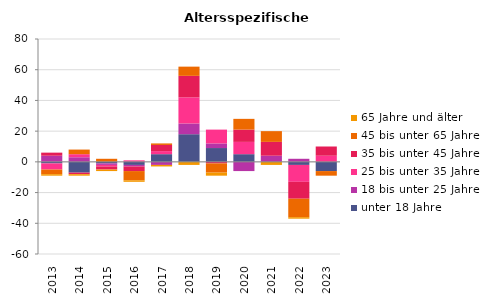
| Category | unter 18 Jahre | 18 bis unter 25 Jahre | 25 bis unter 35 Jahre | 35 bis unter 45 Jahre | 45 bis unter 65 Jahre | 65 Jahre und älter |
|---|---|---|---|---|---|---|
| 2013.0 | -1 | 4 | -4 | 2 | -3 | -1 |
| 2014.0 | -7 | 3 | 2 | -1 | 3 | -1 |
| 2015.0 | -1 | -1 | -1 | -2 | 2 | -1 |
| 2016.0 | -2 | -1 | 1 | -3 | -6 | -1 |
| 2017.0 | 5 | -2 | 2 | 4 | 1 | -1 |
| 2018.0 | 18 | 7 | 17 | 14 | 6 | -2 |
| 2019.0 | 9 | 3 | 9 | -1 | -6 | -2 |
| 2020.0 | 5 | -6 | 8 | 8 | 7 | 0 |
| 2021.0 | 0 | 4 | 0 | 9 | 7 | -2 |
| 2022.0 | -2 | 2 | -11 | -11 | -12 | -1 |
| 2023.0 | -6 | 0 | 4 | 6 | -3 | 0 |